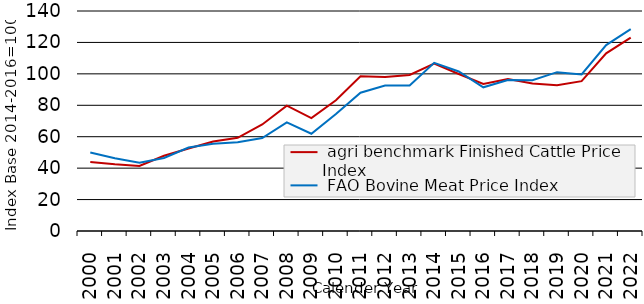
| Category |  agri benchmark Finished Cattle Price Index  |  FAO Bovine Meat Price Index |
|---|---|---|
| 2000.0 | 43.97 | 50.005 |
| 2001.0 | 42.513 | 46.266 |
| 2002.0 | 41.441 | 43.382 |
| 2003.0 | 47.897 | 46.506 |
| 2004.0 | 52.462 | 53.096 |
| 2005.0 | 56.957 | 55.546 |
| 2006.0 | 59.329 | 56.553 |
| 2007.0 | 67.797 | 59.197 |
| 2008.0 | 79.716 | 69.168 |
| 2009.0 | 71.84 | 61.913 |
| 2010.0 | 83.231 | 74.496 |
| 2011.0 | 98.479 | 88.025 |
| 2012.0 | 97.929 | 92.591 |
| 2013.0 | 99.271 | 92.641 |
| 2014.0 | 106.57 | 107.04 |
| 2015.0 | 99.909 | 101.532 |
| 2016.0 | 93.521 | 91.428 |
| 2017.0 | 96.709 | 96.018 |
| 2018.0 | 93.877 | 95.985 |
| 2019.0 | 92.705 | 101.09 |
| 2020.0 | 95.331 | 99.667 |
| 2021.0 | 113.047 | 118.34 |
| 2022.0 | 123.109 | 128.487 |